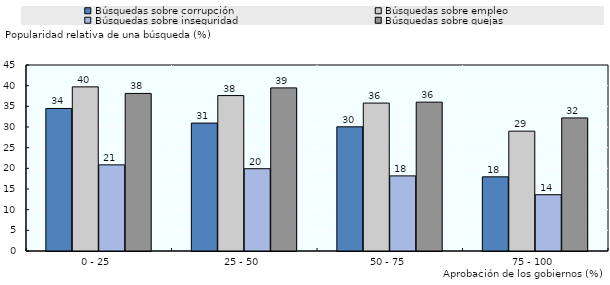
| Category | Búsquedas sobre corrupción | Búsquedas sobre empleo | Búsquedas sobre inseguridad | Búsquedas sobre quejas |
|---|---|---|---|---|
| 0 - 25  | 34.485 | 39.708 | 20.838 | 38.123 |
| 25 - 50 | 30.948 | 37.606 | 19.909 | 39.463 |
| 50 - 75 | 30.047 | 35.787 | 18.172 | 36.011 |
| 75 - 100 | 17.942 | 28.993 | 13.613 | 32.197 |